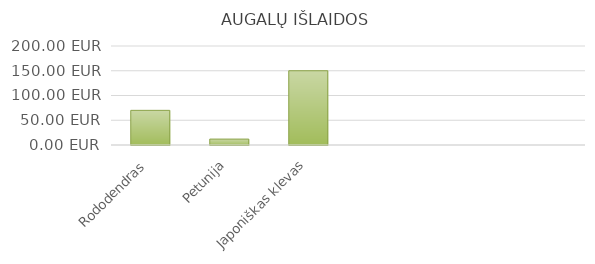
| Category | Rododendras |
|---|---|
| Rododendras | 70 |
| Petunija | 11.94 |
| Japoniškas klevas | 150 |